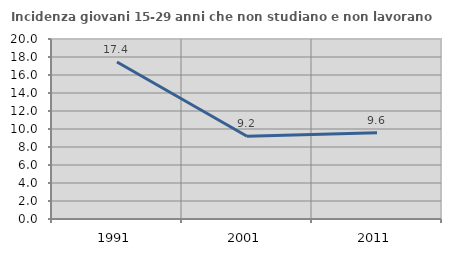
| Category | Incidenza giovani 15-29 anni che non studiano e non lavorano  |
|---|---|
| 1991.0 | 17.437 |
| 2001.0 | 9.198 |
| 2011.0 | 9.596 |